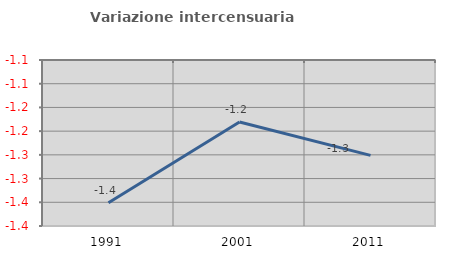
| Category | Variazione intercensuaria annua |
|---|---|
| 1991.0 | -1.351 |
| 2001.0 | -1.181 |
| 2011.0 | -1.251 |